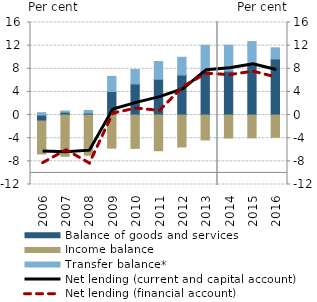
| Category | Balance of goods and services | Income balance | Transfer balance* |
|---|---|---|---|
| 2006.0 | -1.031 | -5.7 | 0.418 |
| 2007.0 | 0.498 | -7.131 | 0.202 |
| 2008.0 | 0.36 | -6.946 | 0.439 |
| 2009.0 | 4.069 | -5.722 | 2.617 |
| 2010.0 | 5.375 | -5.752 | 2.492 |
| 2011.0 | 6.189 | -6.165 | 3.071 |
| 2012.0 | 6.928 | -5.522 | 3.059 |
| 2013.0 | 7.586 | -4.296 | 4.474 |
| 2014.0 | 7.595 | -3.961 | 4.474 |
| 2015.0 | 8.665 | -3.934 | 4.037 |
| 2016.0 | 9.701 | -3.836 | 1.921 |